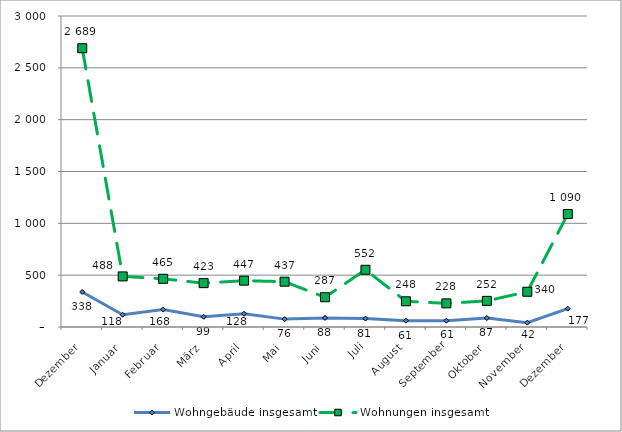
| Category | Wohngebäude insgesamt | Wohnungen insgesamt |
|---|---|---|
| Dezember | 338 | 2689 |
| Januar | 118 | 488 |
| Februar | 168 | 465 |
| März | 99 | 423 |
| April | 128 | 447 |
| Mai | 76 | 437 |
| Juni | 88 | 287 |
| Juli | 81 | 552 |
| August | 61 | 248 |
| September | 61 | 228 |
| Oktober | 87 | 252 |
| November | 42 | 340 |
| Dezember | 177 | 1090 |